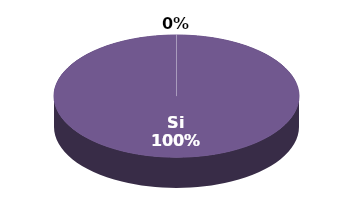
| Category | Series 1 |
|---|---|
| Si | 11 |